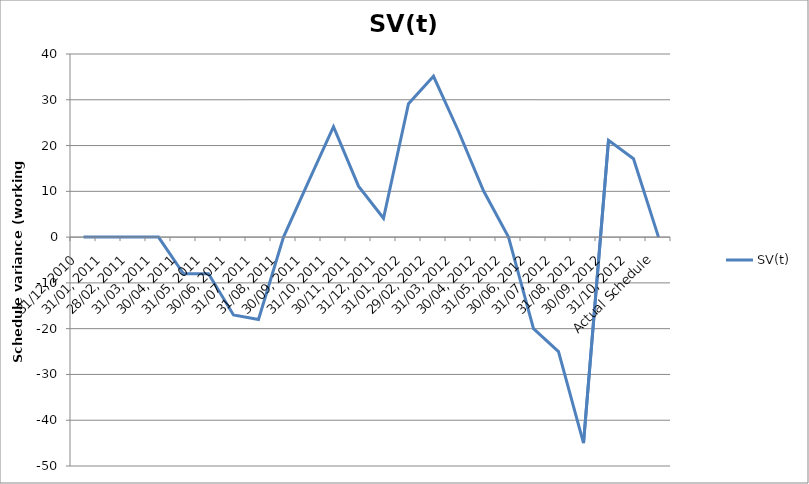
| Category | SV(t) |
|---|---|
| 31/12, 2010 | 0 |
| 31/01, 2011 | 0 |
| 28/02, 2011 | 0 |
| 31/03, 2011 | 0 |
| 30/04, 2011 | -8 |
| 31/05, 2011 | -8 |
| 30/06, 2011 | -17 |
| 31/07, 2011 | -18 |
| 31/08, 2011 | 0 |
| 30/09, 2011 | 12.125 |
| 31/10, 2011 | 24.125 |
| 30/11, 2011 | 11.125 |
| 31/12, 2011 | 4.125 |
| 31/01, 2012 | 29.125 |
| 29/02, 2012 | 35.125 |
| 31/03, 2012 | 23.125 |
| 30/04, 2012 | 10.125 |
| 31/05, 2012 | 0 |
| 30/06, 2012 | -20 |
| 31/07, 2012 | -25 |
| 31/08, 2012 | -45 |
| 30/09, 2012 | 21.125 |
| 31/10, 2012 | 17.125 |
| Actual Schedule | 0 |